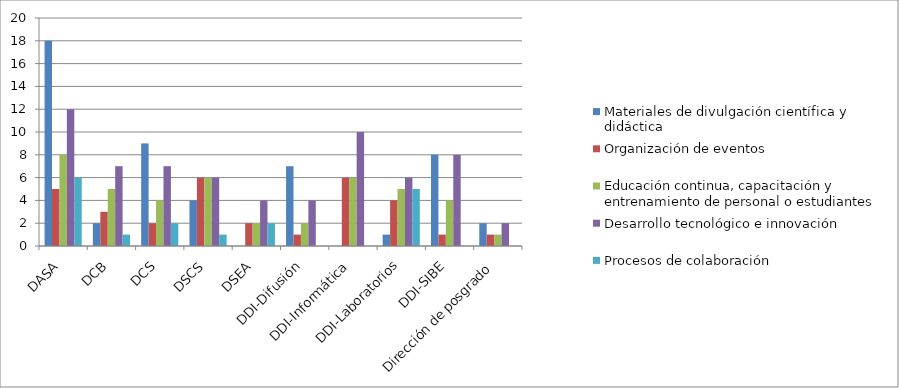
| Category | Materiales de divulgación científica y didáctica | Organización de eventos | Educación continua, capacitación y entrenamiento de personal o estudiantes | Desarrollo tecnológico e innovación | Procesos de colaboración |
|---|---|---|---|---|---|
| DASA | 18 | 5 | 8 | 12 | 6 |
| DCB | 2 | 3 | 5 | 7 | 1 |
| DCS | 9 | 2 | 4 | 7 | 2 |
| DSCS | 4 | 6 | 6 | 6 | 1 |
| DSEA | 0 | 2 | 2 | 4 | 2 |
| DDI-Difusión | 7 | 1 | 2 | 4 | 0 |
| DDI-Informática | 0 | 6 | 6 | 10 | 0 |
| DDI-Laboratorios | 1 | 4 | 5 | 6 | 5 |
| DDI-SIBE | 8 | 1 | 4 | 8 | 0 |
| Dirección de posgrado | 2 | 1 | 1 | 2 | 0 |